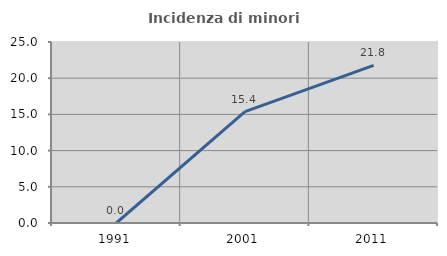
| Category | Incidenza di minori stranieri |
|---|---|
| 1991.0 | 0 |
| 2001.0 | 15.385 |
| 2011.0 | 21.769 |